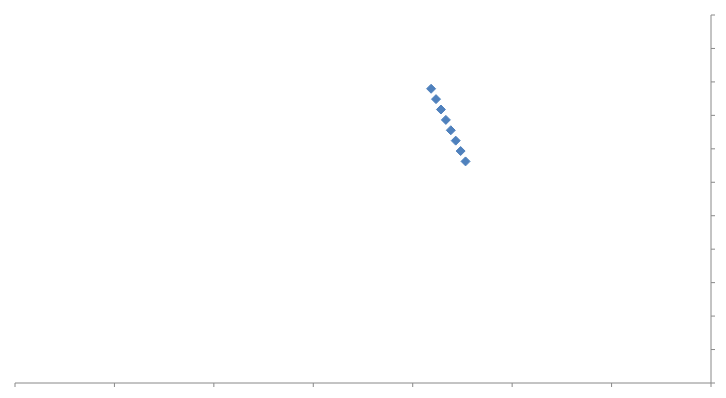
| Category | Series 0 |
|---|---|
| 85.90753282442748 | 37.559 |
| 85.88278473282443 | 37.497 |
| 85.85803664122137 | 37.435 |
| 85.83328854961833 | 37.373 |
| 85.80854045801527 | 37.311 |
| 85.78379236641221 | 37.249 |
| 85.75904427480917 | 37.187 |
| 85.73429618320611 | 37.125 |